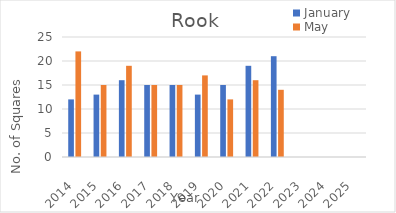
| Category | January | May |
|---|---|---|
| 2014.0 | 12 | 22 |
| 2015.0 | 13 | 15 |
| 2016.0 | 16 | 19 |
| 2017.0 | 15 | 15 |
| 2018.0 | 15 | 15 |
| 2019.0 | 13 | 17 |
| 2020.0 | 15 | 12 |
| 2021.0 | 19 | 16 |
| 2022.0 | 21 | 14 |
| 2023.0 | 0 | 0 |
| 2024.0 | 0 | 0 |
| 2025.0 | 0 | 0 |